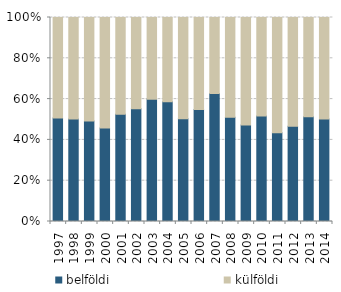
| Category | belföldi | külföldi |
|---|---|---|
| 1997.0 | 1569 | 1522 |
| 1998.0 | 1778 | 1764 |
| 1999.0 | 1912 | 1968 |
| 2000.0 | 1905 | 2255 |
| 2001.0 | 2019 | 1823 |
| 2002.0 | 1986 | 1609 |
| 2003.0 | 2637 | 1763 |
| 2004.0 | 2516 | 1771 |
| 2005.0 | 2547 | 2513 |
| 2006.0 | 2916 | 2394 |
| 2007.0 | 3518 | 2090 |
| 2008.0 | 3267 | 3130 |
| 2009.0 | 2007 | 2233 |
| 2010.0 | 2034 | 1895 |
| 2011.0 | 1977 | 2570 |
| 2012.0 | 1685 | 1924 |
| 2013.0 | 2083 | 1977 |
| 2014.0 | 2123 | 2107 |